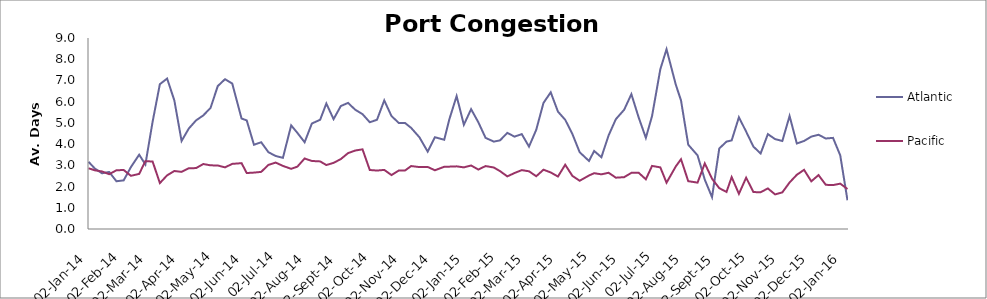
| Category | Atlantic  | Pacific |
|---|---|---|
| 2014-01-02 | 3.167 | 2.863 |
| 2014-01-08 | 2.854 | 2.767 |
| 2014-01-15 | 2.625 | 2.712 |
| 2014-01-22 | 2.688 | 2.582 |
| 2014-01-29 | 2.25 | 2.767 |
| 2014-02-05 | 2.292 | 2.781 |
| 2014-02-12 | 2.917 | 2.507 |
| 2014-02-20 | 3.5 | 2.596 |
| 2014-02-26 | 3.042 | 3.199 |
| 2014-03-05 | 5.059 | 3.178 |
| 2014-03-12 | 6.824 | 2.164 |
| 2014-03-19 | 7.088 | 2.527 |
| 2014-03-26 | 6.059 | 2.733 |
| 2014-04-02 | 4.147 | 2.692 |
| 2014-04-09 | 4.735 | 2.863 |
| 2014-04-16 | 5.118 | 2.87 |
| 2014-04-23 | 5.353 | 3.062 |
| 2014-04-30 | 5.706 | 3 |
| 2014-05-07 | 6.735 | 2.993 |
| 2014-05-14 | 7.059 | 2.904 |
| 2014-05-21 | 6.853 | 3.068 |
| 2014-05-30 | 5.206 | 3.103 |
| 2014-06-04 | 5.118 | 2.637 |
| 2014-06-11 | 3.971 | 2.658 |
| 2014-06-18 | 4.088 | 2.692 |
| 2014-06-25 | 3.618 | 3.021 |
| 2014-07-02 | 3.441 | 3.13 |
| 2014-07-09 | 3.353 | 2.973 |
| 2014-07-17 | 4.882 | 2.836 |
| 2014-07-23 | 4.529 | 2.938 |
| 2014-07-30 | 4.088 | 3.322 |
| 2014-08-06 | 4.971 | 3.205 |
| 2014-08-14 | 5.147 | 3.185 |
| 2014-08-20 | 5.912 | 3.014 |
| 2014-08-27 | 5.176 | 3.116 |
| 2014-09-03 | 5.794 | 3.295 |
| 2014-09-10 | 5.941 | 3.575 |
| 2014-09-17 | 5.618 | 3.699 |
| 2014-09-24 | 5.412 | 3.753 |
| 2014-10-01 | 5.029 | 2.781 |
| 2014-10-08 | 5.147 | 2.753 |
| 2014-10-15 | 6.059 | 2.785 |
| 2014-10-22 | 5.324 | 2.541 |
| 2014-10-29 | 5 | 2.753 |
| 2014-11-04 | 5 | 2.753 |
| 2014-11-10 | 4.765 | 2.966 |
| 2014-11-18 | 4.324 | 2.918 |
| 2014-11-26 | 3.647 | 2.925 |
| 2014-12-03 | 4.324 | 2.767 |
| 2014-12-12 | 4.206 | 2.932 |
| 2014-12-17 | 5.176 | 2.938 |
| 2014-12-24 | 6.265 | 2.952 |
| 2014-12-31 | 4.912 | 2.904 |
| 2015-01-07 | 5.647 | 2.993 |
| 2015-01-14 | 5.029 | 2.801 |
| 2015-01-21 | 4.294 | 2.966 |
| 2015-01-29 | 4.118 | 2.897 |
| 2015-02-04 | 4.176 | 2.726 |
| 2015-02-11 | 4.529 | 2.479 |
| 2015-02-18 | 4.353 | 2.637 |
| 2015-02-25 | 4.471 | 2.774 |
| 2015-03-04 | 3.882 | 2.719 |
| 2015-03-11 | 4.676 | 2.486 |
| 2015-03-18 | 5.941 | 2.795 |
| 2015-03-25 | 6.441 | 2.664 |
| 2015-04-01 | 5.529 | 2.473 |
| 2015-04-08 | 5.147 | 3.027 |
| 2015-04-15 | 4.471 | 2.5 |
| 2015-04-22 | 3.618 | 2.274 |
| 2015-05-01 | 3.206 | 2.521 |
| 2015-05-06 | 3.676 | 2.63 |
| 2015-05-13 | 3.382 | 2.575 |
| 2015-05-20 | 4.412 | 2.651 |
| 2015-05-27 | 5.176 | 2.418 |
| 2015-06-04 | 5.618 | 2.442 |
| 2015-06-11 | 6.353 | 2.645 |
| 2015-06-18 | 5.265 | 2.651 |
| 2015-06-25 | 4.294 | 2.342 |
| 2015-07-01 | 5.324 | 2.973 |
| 2015-07-09 | 7.529 | 2.904 |
| 2015-07-15 | 8.471 | 2.182 |
| 2015-07-24 | 6.794 | 2.952 |
| 2015-07-29 | 6.059 | 3.288 |
| 2015-08-05 | 3.971 | 2.253 |
| 2015-08-14 | 3.471 | 2.185 |
| 2015-08-21 | 2.324 | 3.089 |
| 2015-08-28 | 1.5 | 2.37 |
| 2015-09-04 | 3.794 | 1.925 |
| 2015-09-11 | 4.118 | 1.747 |
| 2015-09-16 | 4.176 | 2.445 |
| 2015-09-23 | 5.265 | 1.658 |
| 2015-09-30 | 4.588 | 2.418 |
| 2015-10-07 | 3.882 | 1.74 |
| 2015-10-14 | 3.559 | 1.733 |
| 2015-10-21 | 4.471 | 1.911 |
| 2015-10-28 | 4.235 | 1.63 |
| 2015-11-04 | 4.147 | 1.726 |
| 2015-11-11 | 5.324 | 2.192 |
| 2015-11-18 | 4.029 | 2.555 |
| 2015-11-25 | 4.147 | 2.788 |
| 2015-12-02 | 4.353 | 2.247 |
| 2015-12-09 | 4.441 | 2.541 |
| 2015-12-16 | 4.265 | 2.082 |
| 2015-12-23 | 4.294 | 2.068 |
| 2015-12-30 | 3.471 | 2.137 |
| 2016-01-06 | 1.353 | 1.884 |